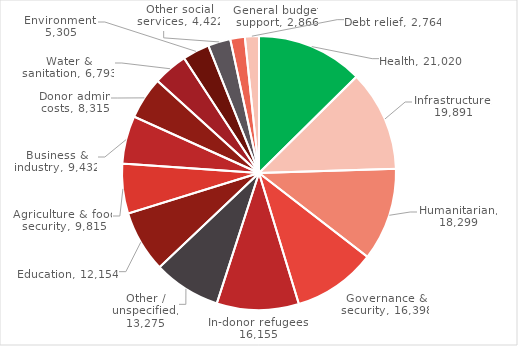
| Category | 2016 |
|---|---|
| Health | 21020.166 |
| Infrastructure | 19891.144 |
| Humanitarian | 18298.727 |
| Governance & security | 16398.011 |
| In-donor refugees | 16154.925 |
| Other / unspecified | 13275.255 |
| Education | 12154.118 |
| Agriculture & food security | 9815.358 |
| Business & industry | 9432.436 |
| Donor admin costs | 8315.121 |
| Water & sanitation | 6793.365 |
| Environment | 5305.168 |
| Other social services | 4421.705 |
| General budget support | 2866.195 |
| Debt relief | 2763.931 |